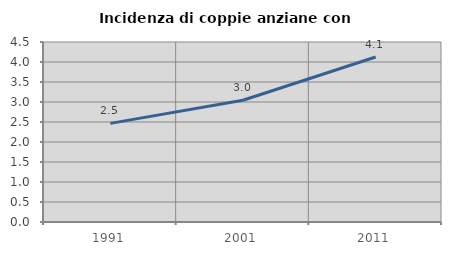
| Category | Incidenza di coppie anziane con figli |
|---|---|
| 1991.0 | 2.466 |
| 2001.0 | 3.043 |
| 2011.0 | 4.126 |